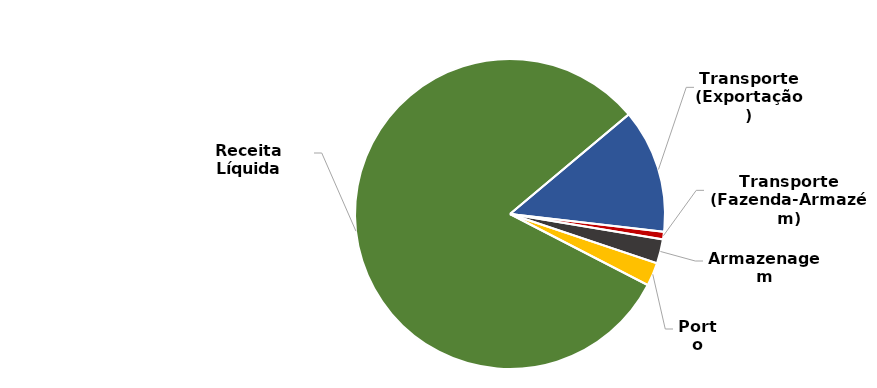
| Category | Series 0 |
|---|---|
| Transporte (Exportação) | 186.5 |
| Transporte (Fazenda-Armazém) | 11.304 |
| Armazenagem | 36.397 |
| Porto | 35 |
| Receita Líquida | 1171.22 |